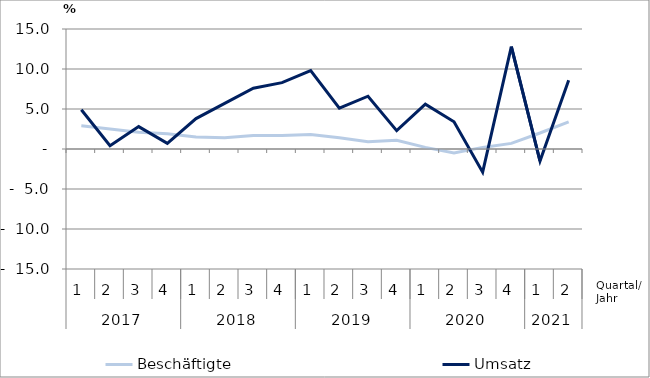
| Category | Beschäftigte | Umsatz |
|---|---|---|
| 0 | 2.9 | 4.9 |
| 1 | 2.5 | 0.4 |
| 2 | 2.1 | 2.8 |
| 3 | 1.9 | 0.7 |
| 4 | 1.5 | 3.8 |
| 5 | 1.4 | 5.7 |
| 6 | 1.7 | 7.6 |
| 7 | 1.7 | 8.3 |
| 8 | 1.8 | 9.8 |
| 9 | 1.4 | 5.1 |
| 10 | 0.9 | 6.6 |
| 11 | 1.1 | 2.3 |
| 12 | 0.2 | 5.6 |
| 13 | -0.5 | 3.4 |
| 14 | 0.2 | -2.9 |
| 15 | 0.7 | 12.8 |
| 16 | 2 | -1.5 |
| 17 | 3.4 | 8.6 |